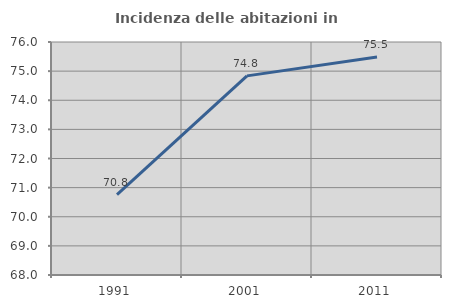
| Category | Incidenza delle abitazioni in proprietà  |
|---|---|
| 1991.0 | 70.759 |
| 2001.0 | 74.837 |
| 2011.0 | 75.484 |